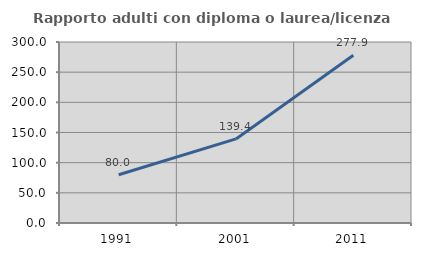
| Category | Rapporto adulti con diploma o laurea/licenza media  |
|---|---|
| 1991.0 | 80 |
| 2001.0 | 139.375 |
| 2011.0 | 277.941 |